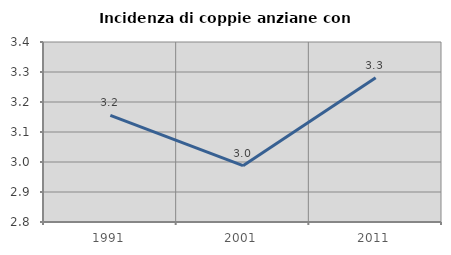
| Category | Incidenza di coppie anziane con figli |
|---|---|
| 1991.0 | 3.156 |
| 2001.0 | 2.988 |
| 2011.0 | 3.281 |